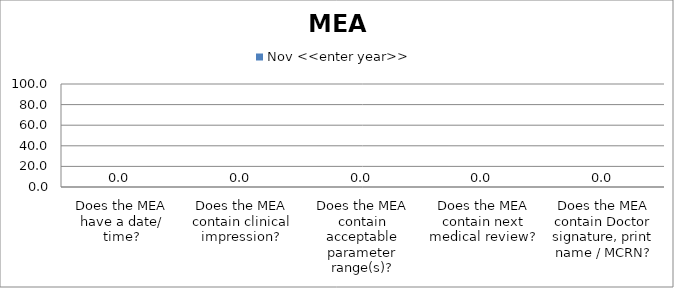
| Category | Nov <<enter year>> |
|---|---|
| Does the MEA have a date/ time? | 0 |
| Does the MEA contain clinical impression? | 0 |
| Does the MEA contain acceptable parameter range(s)? | 0 |
| Does the MEA contain next medical review? | 0 |
| Does the MEA contain Doctor signature, print name / MCRN? | 0 |